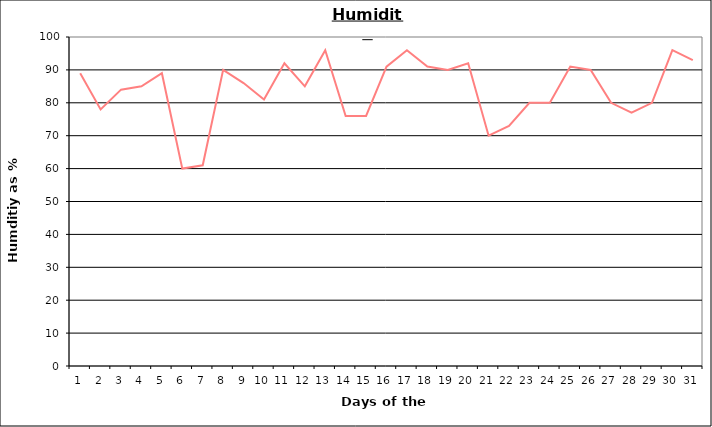
| Category | Series 0 |
|---|---|
| 0 | 89 |
| 1 | 78 |
| 2 | 84 |
| 3 | 85 |
| 4 | 89 |
| 5 | 60 |
| 6 | 61 |
| 7 | 90 |
| 8 | 86 |
| 9 | 81 |
| 10 | 92 |
| 11 | 85 |
| 12 | 96 |
| 13 | 76 |
| 14 | 76 |
| 15 | 91 |
| 16 | 96 |
| 17 | 91 |
| 18 | 90 |
| 19 | 92 |
| 20 | 70 |
| 21 | 73 |
| 22 | 80 |
| 23 | 80 |
| 24 | 91 |
| 25 | 90 |
| 26 | 80 |
| 27 | 77 |
| 28 | 80 |
| 29 | 96 |
| 30 | 93 |